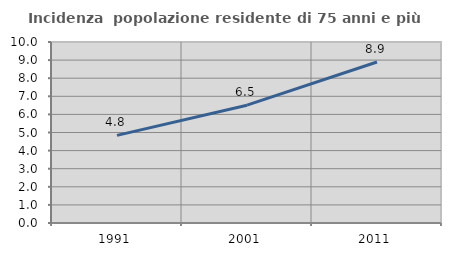
| Category | Incidenza  popolazione residente di 75 anni e più |
|---|---|
| 1991.0 | 4.842 |
| 2001.0 | 6.51 |
| 2011.0 | 8.894 |